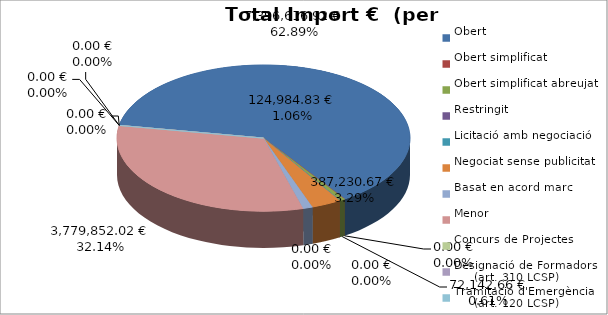
| Category | Total preu
(amb IVA) |
|---|---|
| Obert | 7396616.92 |
| Obert simplificat | 0 |
| Obert simplificat abreujat | 72142.66 |
| Restringit | 0 |
| Licitació amb negociació | 0 |
| Negociat sense publicitat | 387230.67 |
| Basat en acord marc | 124984.83 |
| Menor | 3779852.02 |
| Concurs de Projectes | 0 |
| Designació de Formadors
     (art. 310 LCSP) | 0 |
| Tramitació d'Emergència
     (art. 120 LCSP) | 0 |